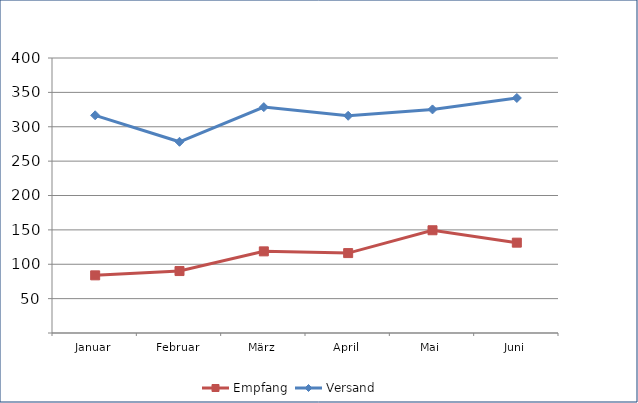
| Category | Empfang | Versand |
|---|---|---|
| Januar | 83.852 | 316.638 |
| Februar | 90.1 | 278.129 |
| März | 118.744 | 328.551 |
| April | 116.23 | 315.935 |
| Mai | 149.438 | 325.22 |
| Juni | 131.405 | 341.842 |